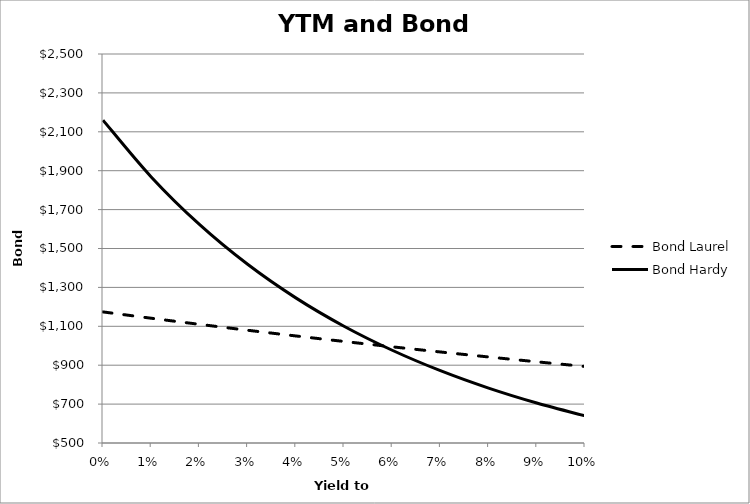
| Category | Bond Laurel | Bond Hardy |
|---|---|---|
| 0.0 | 1174 | 2160 |
| 0.01 | 1141.513 | 1868.133 |
| 0.02 | 1110.114 | 1623.859 |
| 0.03 | 1079.761 | 1418.822 |
| 0.04 | 1050.413 | 1246.199 |
| 0.05 | 1022.033 | 1100.411 |
| 0.06 | 994.583 | 976.885 |
| 0.07 | 968.029 | 871.87 |
| 0.08 | 942.336 | 782.279 |
| 0.09 | 917.474 | 705.575 |
| 0.1 | 893.41 | 639.659 |